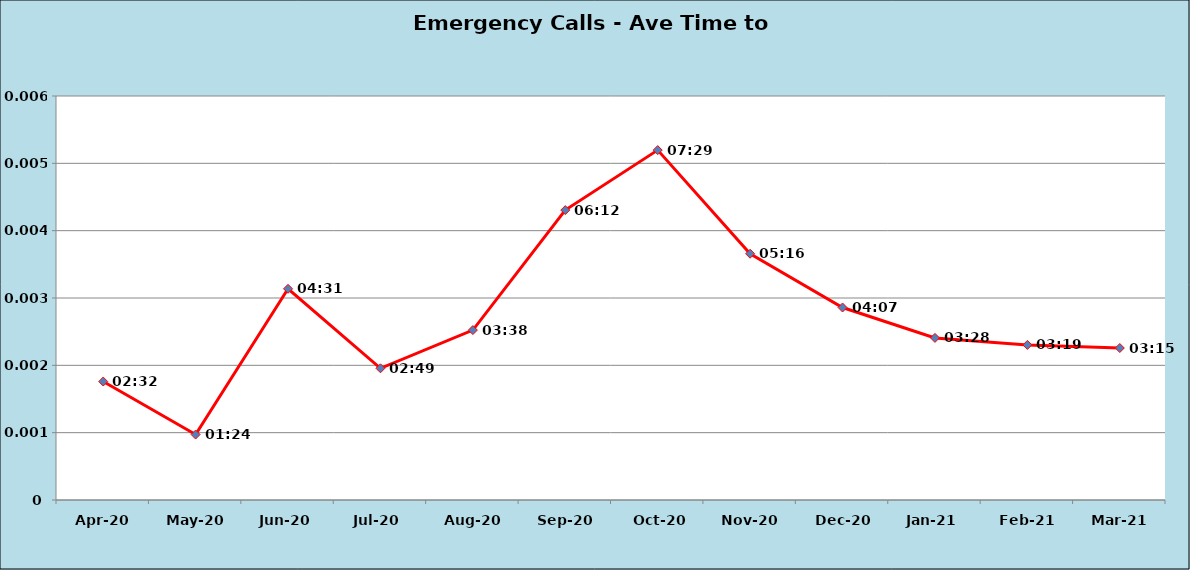
| Category | Emergency Calls - Ave Time to Abandon |
|---|---|
| Apr-20 | 0.002 |
| May-20 | 0.001 |
| Jun-20 | 0.003 |
| Jul-20 | 0.002 |
| Aug-20 | 0.003 |
| Sep-20 | 0.004 |
| Oct-20 | 0.005 |
| Nov-20 | 0.004 |
| Dec-20 | 0.003 |
| Jan-21 | 0.002 |
| Feb-21 | 0.002 |
| Mar-21 | 0.002 |